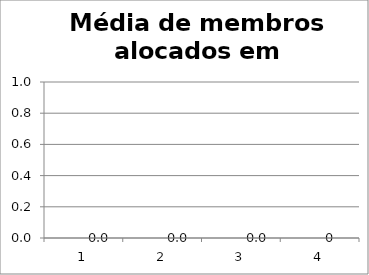
| Category | Series 0 | Series 1 |
|---|---|---|
| 1 | 0 |  |
| 2 | 0 |  |
| 3 | 0 |  |
| 4 | 0 |  |